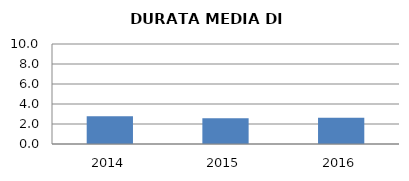
| Category | 2014 2015 2016 |
|---|---|
| 2014.0 | 2.783 |
| 2015.0 | 2.579 |
| 2016.0 | 2.636 |